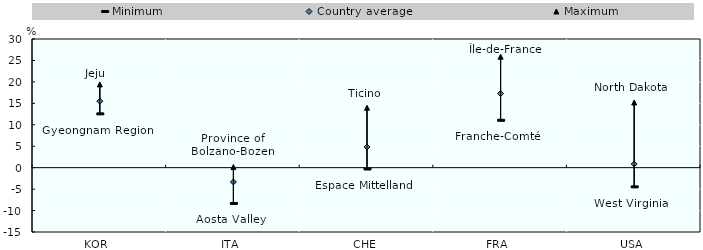
| Category | Minimum | Country average | Maximum |
|---|---|---|---|
| KOR | 12.545 | 15.507 | 19.409 |
| ITA | -8.346 | -3.332 | 0.136 |
| CHE | -0.308 | 4.815 | 13.969 |
| FRA | 11.049 | 17.292 | 25.862 |
| USA | -4.48 | 0.855 | 15.2 |